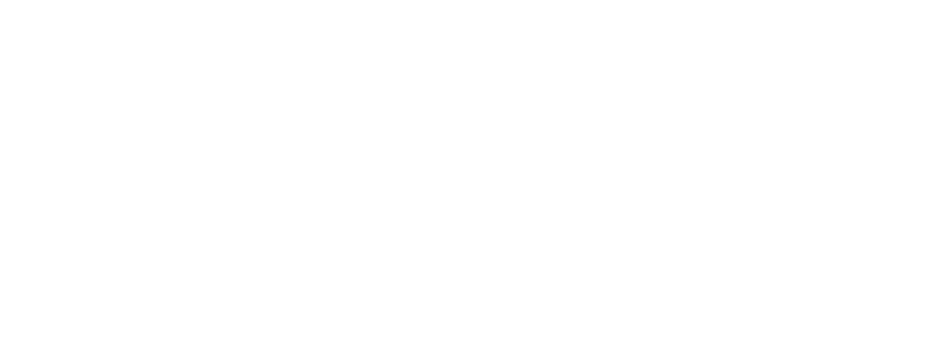
| Category | Quadro Resumo - Bônus-Desconto |
|---|---|
| Residencial Normal | 8774797.908 |
| Residencial Popular | 149030.9 |
| Comercial | 1746597.888 |
| Industrial | 48182.4 |